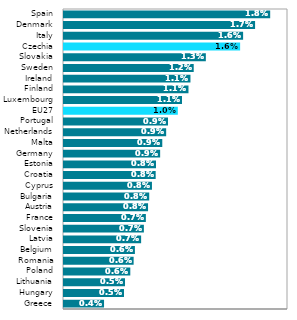
| Category | Series 0 |
|---|---|
| Greece | 0.004 |
| Hungary | 0.005 |
| Lithuania | 0.005 |
| Poland | 0.006 |
| Romania | 0.006 |
| Belgium | 0.006 |
| Latvia | 0.007 |
| Slovenia | 0.007 |
| France | 0.007 |
| Austria | 0.008 |
| Bulgaria | 0.008 |
| Cyprus | 0.008 |
| Croatia | 0.008 |
| Estonia | 0.008 |
| Germany | 0.009 |
| Malta | 0.009 |
| Netherlands | 0.009 |
| Portugal | 0.009 |
| EU27 | 0.01 |
| Luxembourg | 0.011 |
| Finland | 0.011 |
| Ireland | 0.011 |
| Sweden | 0.012 |
| Slovakia | 0.013 |
| Czechia | 0.016 |
| Italy | 0.016 |
| Denmark | 0.017 |
| Spain | 0.018 |